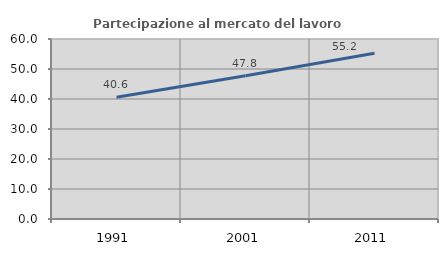
| Category | Partecipazione al mercato del lavoro  femminile |
|---|---|
| 1991.0 | 40.577 |
| 2001.0 | 47.78 |
| 2011.0 | 55.242 |